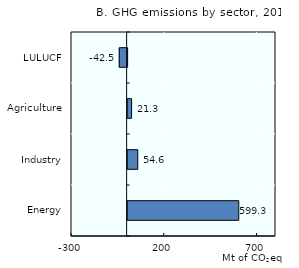
| Category | GHG emissions |
|---|---|
| Energy | 599.3 |
| Industry | 54.6 |
| Agriculture | 21.3 |
| LULUCF | -42.5 |